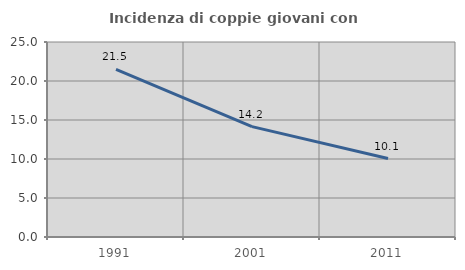
| Category | Incidenza di coppie giovani con figli |
|---|---|
| 1991.0 | 21.477 |
| 2001.0 | 14.153 |
| 2011.0 | 10.055 |